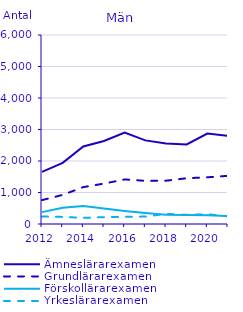
| Category | Ämneslärarexamen                                   | Grundlärarexamen                                   | Förskollärarexamen                                 | Yrkeslärarexamen                                   |
|---|---|---|---|---|
| 2012 | 1654 | 759 | 377 | 239 |
| 2013 | 1940 | 924 | 513 | 225 |
| 2014 | 2460 | 1171 | 569 | 196 |
| 2015 | 2637 | 1283 | 490 | 216 |
| 2016 | 2901 | 1415 | 415 | 231 |
| 2017 | 2654 | 1370 | 349 | 235 |
| 2018 | 2552 | 1374 | 297 | 322 |
| 2019 | 2526 | 1453 | 283 | 290 |
| 2020 | 2872 | 1483 | 279 | 310 |
| 2021 | 2800 | 1529 | 253 | 243 |